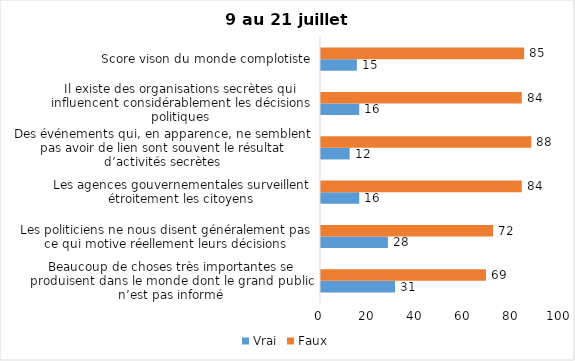
| Category | Vrai | Faux |
|---|---|---|
| Beaucoup de choses très importantes se produisent dans le monde dont le grand public n’est pas informé | 31 | 69 |
| Les politiciens ne nous disent généralement pas ce qui motive réellement leurs décisions | 28 | 72 |
| Les agences gouvernementales surveillent étroitement les citoyens | 16 | 84 |
| Des événements qui, en apparence, ne semblent pas avoir de lien sont souvent le résultat d’activités secrètes | 12 | 88 |
| Il existe des organisations secrètes qui influencent considérablement les décisions politiques | 16 | 84 |
| Score vison du monde complotiste | 15 | 85 |